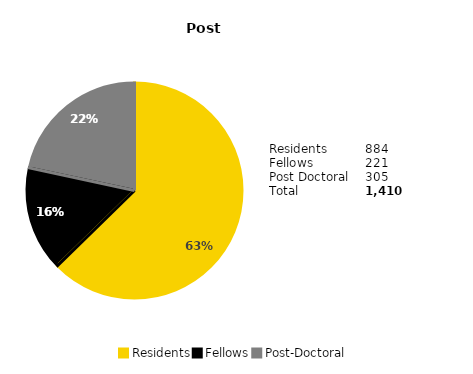
| Category | Series 0 |
|---|---|
| Residents | 0.627 |
| Fellows | 0.157 |
| Post-Doctoral | 0.216 |